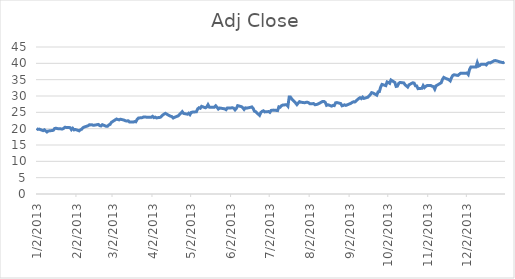
| Category | Adj Close |
|---|---|
| 12/31/13 | 40.44 |
| 12/30/13 | 40.2 |
| 12/27/13 | 40.49 |
| 12/26/13 | 40.65 |
| 12/24/13 | 40.85 |
| 12/23/13 | 40.77 |
| 12/20/13 | 40.12 |
| 12/19/13 | 40.2 |
| 12/18/13 | 40.04 |
| 12/17/13 | 39.51 |
| 12/16/13 | 39.73 |
| 12/13/13 | 39.73 |
| 12/12/13 | 39.35 |
| 12/11/13 | 39.16 |
| 12/10/13 | 40.22 |
| 12/9/13 | 38.87 |
| 12/6/13 | 38.86 |
| 12/5/13 | 38.87 |
| 12/4/13 | 38.13 |
| 12/3/13 | 36.56 |
| 12/2/13 | 37.01 |
| 11/29/13 | 36.98 |
| 11/27/13 | 36.96 |
| 11/26/13 | 36.64 |
| 11/25/13 | 36.29 |
| 11/22/13 | 36.49 |
| 11/21/13 | 36.3 |
| 11/20/13 | 35.62 |
| 11/19/13 | 34.63 |
| 11/18/13 | 34.98 |
| 11/15/13 | 35.47 |
| 11/14/13 | 35.69 |
| 11/13/13 | 35.1 |
| 11/12/13 | 34.07 |
| 11/11/13 | 33.82 |
| 11/8/13 | 33.12 |
| 11/7/13 | 32.11 |
| 11/6/13 | 32.88 |
| 11/5/13 | 32.97 |
| 11/4/13 | 33.19 |
| 11/1/13 | 33.18 |
| 10/31/13 | 32.94 |
| 10/30/13 | 32.57 |
| 10/29/13 | 33.17 |
| 10/28/13 | 32.35 |
| 10/25/13 | 32.25 |
| 10/24/13 | 33.08 |
| 10/23/13 | 33.1 |
| 10/22/13 | 33.94 |
| 10/21/13 | 34.06 |
| 10/18/13 | 33.43 |
| 10/17/13 | 32.74 |
| 10/16/13 | 33.09 |
| 10/15/13 | 33.38 |
| 10/14/13 | 34 |
| 10/11/13 | 34.15 |
| 10/10/13 | 33.87 |
| 10/9/13 | 33.01 |
| 10/8/13 | 32.93 |
| 10/7/13 | 34.14 |
| 10/4/13 | 34.89 |
| 10/3/13 | 33.88 |
| 10/2/13 | 34.14 |
| 10/1/13 | 34.31 |
| 9/30/13 | 33.17 |
| 9/27/13 | 33.55 |
| 9/26/13 | 32.75 |
| 9/25/13 | 31.34 |
| 9/24/13 | 31.27 |
| 9/23/13 | 30.26 |
| 9/20/13 | 30.93 |
| 9/19/13 | 31.03 |
| 9/18/13 | 30.44 |
| 9/17/13 | 30 |
| 9/16/13 | 29.62 |
| 9/13/13 | 29.26 |
| 9/12/13 | 29.65 |
| 9/11/13 | 29.19 |
| 9/10/13 | 29.48 |
| 9/9/13 | 29.24 |
| 9/6/13 | 28.17 |
| 9/5/13 | 28.23 |
| 9/4/13 | 28.07 |
| 9/3/13 | 27.78 |
| 8/30/13 | 27.12 |
| 8/29/13 | 27.3 |
| 8/28/13 | 27.11 |
| 8/27/13 | 27 |
| 8/26/13 | 27.7 |
| 8/23/13 | 27.99 |
| 8/22/13 | 27.9 |
| 8/21/13 | 27.06 |
| 8/20/13 | 27.12 |
| 8/19/13 | 26.91 |
| 8/16/13 | 27.32 |
| 8/15/13 | 27.14 |
| 8/14/13 | 28.05 |
| 8/13/13 | 28.34 |
| 8/12/13 | 28.35 |
| 8/9/13 | 27.68 |
| 8/8/13 | 27.48 |
| 8/7/13 | 27.39 |
| 8/6/13 | 27.32 |
| 8/5/13 | 27.67 |
| 8/2/13 | 27.65 |
| 8/1/13 | 27.96 |
| 7/31/13 | 28.09 |
| 7/30/13 | 28.05 |
| 7/29/13 | 27.93 |
| 7/26/13 | 28.11 |
| 7/25/13 | 28.27 |
| 7/24/13 | 27.84 |
| 7/23/13 | 27.36 |
| 7/22/13 | 27.86 |
| 7/19/13 | 29.11 |
| 7/18/13 | 29.66 |
| 7/17/13 | 29.66 |
| 7/16/13 | 26.88 |
| 7/15/13 | 27.34 |
| 7/12/13 | 27.23 |
| 7/11/13 | 27.04 |
| 7/10/13 | 26.56 |
| 7/9/13 | 26.68 |
| 7/8/13 | 25.53 |
| 7/5/13 | 25.68 |
| 7/3/13 | 25.59 |
| 7/2/13 | 24.99 |
| 7/1/13 | 25.24 |
| 6/28/13 | 25.13 |
| 6/27/13 | 25.47 |
| 6/26/13 | 25.29 |
| 6/25/13 | 24.96 |
| 6/24/13 | 24.07 |
| 6/21/13 | 25.19 |
| 6/20/13 | 25.35 |
| 6/19/13 | 26.24 |
| 6/18/13 | 26.66 |
| 6/17/13 | 26.54 |
| 6/14/13 | 26.28 |
| 6/13/13 | 26.37 |
| 6/12/13 | 25.89 |
| 6/11/13 | 26.4 |
| 6/10/13 | 26.74 |
| 6/7/13 | 27.04 |
| 6/6/13 | 26.21 |
| 6/5/13 | 25.75 |
| 6/4/13 | 26.26 |
| 6/3/13 | 26.39 |
| 5/31/13 | 26.3 |
| 5/30/13 | 26.33 |
| 5/29/13 | 25.81 |
| 5/28/13 | 26.07 |
| 5/24/13 | 26.33 |
| 5/23/13 | 26.02 |
| 5/22/13 | 26.54 |
| 5/21/13 | 27 |
| 5/20/13 | 26.58 |
| 5/17/13 | 26.52 |
| 5/16/13 | 26.58 |
| 5/15/13 | 27.34 |
| 5/14/13 | 26.64 |
| 5/13/13 | 26.39 |
| 5/10/13 | 26.83 |
| 5/9/13 | 26.24 |
| 5/8/13 | 26.41 |
| 5/7/13 | 26.07 |
| 5/6/13 | 25.17 |
| 5/3/13 | 25.07 |
| 5/2/13 | 24.97 |
| 5/1/13 | 24.3 |
| 4/30/13 | 24.73 |
| 4/29/13 | 24.43 |
| 4/26/13 | 24.68 |
| 4/25/13 | 25.2 |
| 4/24/13 | 24.75 |
| 4/23/13 | 24.38 |
| 4/22/13 | 23.95 |
| 4/19/13 | 23.47 |
| 4/18/13 | 23.26 |
| 4/17/13 | 23.7 |
| 4/16/13 | 23.79 |
| 4/15/13 | 23.98 |
| 4/12/13 | 24.69 |
| 4/11/13 | 24.49 |
| 4/10/13 | 24.2 |
| 4/9/13 | 23.83 |
| 4/8/13 | 23.48 |
| 4/5/13 | 23.3 |
| 4/4/13 | 23.52 |
| 4/3/13 | 23.38 |
| 4/2/13 | 23.78 |
| 4/1/13 | 23.5 |
| 3/28/13 | 23.53 |
| 3/27/13 | 23.59 |
| 3/26/13 | 23.59 |
| 3/25/13 | 23.38 |
| 3/22/13 | 23.26 |
| 3/21/13 | 22.86 |
| 3/20/13 | 22.1 |
| 3/19/13 | 22.17 |
| 3/18/13 | 22.01 |
| 3/15/13 | 22.07 |
| 3/14/13 | 22.43 |
| 3/13/13 | 22.34 |
| 3/12/13 | 22.4 |
| 3/11/13 | 22.6 |
| 3/8/13 | 22.9 |
| 3/7/13 | 22.7 |
| 3/6/13 | 22.8 |
| 3/5/13 | 22.95 |
| 3/4/13 | 22.7 |
| 3/1/13 | 21.94 |
| 2/28/13 | 21.31 |
| 2/27/13 | 21.16 |
| 2/26/13 | 20.76 |
| 2/25/13 | 20.73 |
| 2/22/13 | 21.22 |
| 2/21/13 | 20.83 |
| 2/20/13 | 20.92 |
| 2/19/13 | 21.29 |
| 2/15/13 | 21.02 |
| 2/14/13 | 21.18 |
| 2/13/13 | 21.15 |
| 2/12/13 | 21.21 |
| 2/11/13 | 20.9 |
| 2/8/13 | 20.5 |
| 2/7/13 | 20.32 |
| 2/6/13 | 19.85 |
| 2/5/13 | 19.66 |
| 2/4/13 | 19.34 |
| 2/1/13 | 19.76 |
| 1/31/13 | 19.63 |
| 1/30/13 | 20.12 |
| 1/29/13 | 19.7 |
| 1/28/13 | 20.31 |
| 1/25/13 | 20.37 |
| 1/24/13 | 20.44 |
| 1/23/13 | 20.11 |
| 1/22/13 | 19.9 |
| 1/18/13 | 20.02 |
| 1/17/13 | 20.13 |
| 1/16/13 | 20.07 |
| 1/15/13 | 19.52 |
| 1/14/13 | 19.43 |
| 1/11/13 | 19.29 |
| 1/10/13 | 18.99 |
| 1/9/13 | 19.32 |
| 1/8/13 | 19.66 |
| 1/7/13 | 19.4 |
| 1/4/13 | 19.86 |
| 1/3/13 | 19.78 |
| 1/2/13 | 20.08 |